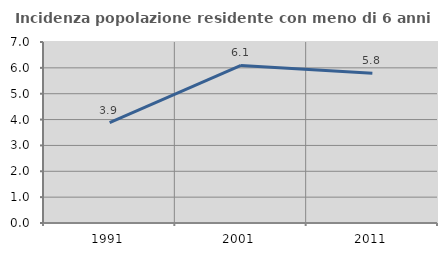
| Category | Incidenza popolazione residente con meno di 6 anni |
|---|---|
| 1991.0 | 3.885 |
| 2001.0 | 6.093 |
| 2011.0 | 5.787 |